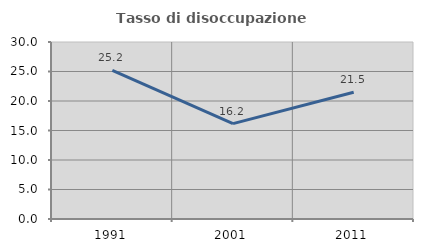
| Category | Tasso di disoccupazione giovanile  |
|---|---|
| 1991.0 | 25.198 |
| 2001.0 | 16.158 |
| 2011.0 | 21.481 |